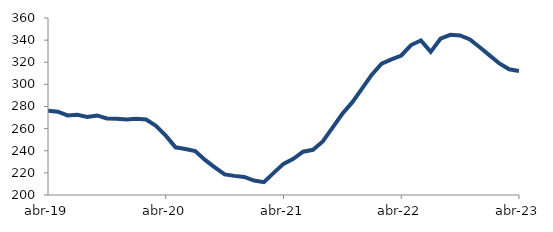
| Category | Series 0 |
|---|---|
| 2019-04-01 | 276.17 |
| 2019-05-01 | 275.323 |
| 2019-06-01 | 271.933 |
| 2019-07-01 | 272.528 |
| 2019-08-01 | 270.617 |
| 2019-09-01 | 271.909 |
| 2019-10-01 | 269.246 |
| 2019-11-01 | 268.873 |
| 2019-12-01 | 268.319 |
| 2020-01-01 | 268.914 |
| 2020-02-01 | 268.233 |
| 2020-03-01 | 262.58 |
| 2020-04-01 | 253.663 |
| 2020-05-01 | 243.088 |
| 2020-06-01 | 241.541 |
| 2020-07-01 | 239.786 |
| 2020-08-01 | 231.766 |
| 2020-09-01 | 225.047 |
| 2020-10-01 | 218.571 |
| 2020-11-01 | 217.286 |
| 2020-12-01 | 216.368 |
| 2021-01-01 | 213.087 |
| 2021-02-01 | 211.643 |
| 2021-03-01 | 220.04 |
| 2021-04-01 | 228.12 |
| 2021-05-01 | 232.717 |
| 2021-06-01 | 239.097 |
| 2021-07-01 | 240.846 |
| 2021-08-01 | 248.449 |
| 2021-09-01 | 260.934 |
| 2021-10-01 | 273.441 |
| 2021-11-01 | 283.683 |
| 2021-12-01 | 296.134 |
| 2022-01-01 | 308.804 |
| 2022-02-01 | 318.726 |
| 2022-03-01 | 322.592 |
| 2022-04-01 | 326.114 |
| 2022-05-01 | 335.557 |
| 2022-06-01 | 339.684 |
| 2022-07-01 | 329.357 |
| 2022-08-01 | 341.293 |
| 2022-09-01 | 344.793 |
| 2022-10-01 | 344.185 |
| 2022-11-01 | 340.608 |
| 2022-12-01 | 333.559 |
| 2023-01-01 | 326.199 |
| 2023-02-01 | 318.915 |
| 2023-03-01 | 313.615 |
| 2023-04-01 | 312.076 |